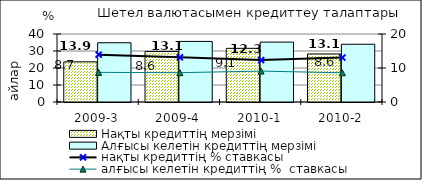
| Category | Нақты кредиттің мерзімі  | Алғысы келетін кредиттің мерзімі  |
|---|---|---|
| 2009-3 | 23.63 | 34.85 |
| 2009-4 | 29.73 | 35.63 |
| 2010-1 | 31.57 | 35.23 |
| 2010-2 | 28.26 | 33.97 |